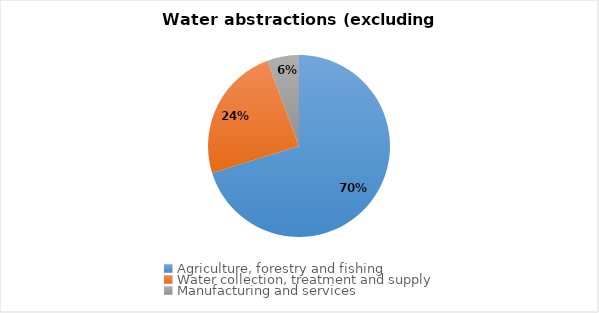
| Category | Series 1 |
|---|---|
| Agriculture, forestry and fishing | 1731.022 |
| Water collection, treatment and supply | 596.262 |
| Manufacturing and services | 138.837 |